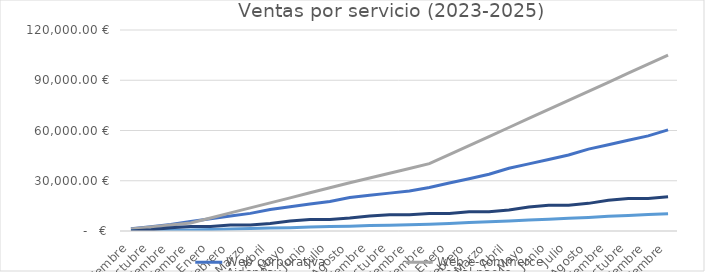
| Category | Web corporativa | Web e-commerce | AidenPay | Social packs |
|---|---|---|---|---|
| Septiembre | 1279.76 | 1199.84 | 112 | 0 |
| Octubre | 2559.52 | 2399.68 | 224 | 719.96 |
| Noviembre | 3839.28 | 3599.52 | 455.96 | 1919.92 |
| Diciembre | 5719 | 4799.36 | 607.92 | 2639.88 |
| Enero | 7318.7 | 7798.96 | 887.92 | 2639.88 |
| Febrero | 8918.4 | 10798.56 | 1167.92 | 3539.83 |
| Marzo | 10518.1 | 13798.16 | 1447.92 | 3539.83 |
| Abril | 12867.75 | 16797.76 | 1727.92 | 4439.78 |
| Mayo | 14467.45 | 19797.36 | 2007.92 | 5939.73 |
| Junio | 16067.15 | 22796.96 | 2337.87 | 6839.68 |
| Julio | 17666.85 | 25796.56 | 2617.87 | 6839.68 |
| Agosto | 20016.5 | 28796.16 | 2897.87 | 7739.63 |
| Septiembre | 21316.24 | 31645.78 | 3273.84 | 8939.59 |
| Octubre | 22615.98 | 34495.4 | 3499.86 | 9659.55 |
| Noviembre | 23915.72 | 37345.02 | 3725.88 | 9659.55 |
| Diciembre | 25965.41 | 40194.64 | 4001.85 | 10379.51 |
| Enero | 28604.93 | 45593.92 | 4505.85 | 10379.51 |
| Febrero | 31244.45 | 50993.2 | 5009.85 | 11459.45 |
| Marzo | 33883.97 | 56392.48 | 5513.85 | 11459.45 |
| Abril | 37423.43 | 61791.76 | 6017.85 | 12539.39 |
| Mayo | 40062.95 | 67191.04 | 6521.85 | 14339.33 |
| Junio | 42702.47 | 72590.32 | 7085.79 | 15419.27 |
| Julio | 45341.99 | 77989.6 | 7589.79 | 15419.27 |
| Agosto | 48881.45 | 83388.88 | 8093.79 | 16499.21 |
| Septiembre | 51520.97 | 88788.16 | 8777.73 | 18299.15 |
| Octubre | 54160.49 | 94187.44 | 9281.73 | 19379.09 |
| Noviembre | 56800.01 | 99586.72 | 9785.73 | 19379.09 |
| Diciembre | 60339.47 | 104986 | 10349.67 | 20459.03 |